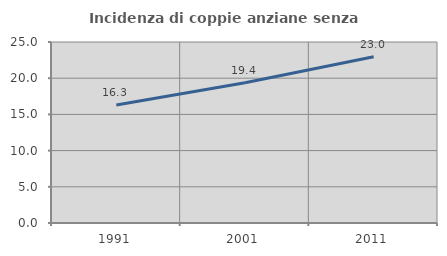
| Category | Incidenza di coppie anziane senza figli  |
|---|---|
| 1991.0 | 16.304 |
| 2001.0 | 19.375 |
| 2011.0 | 22.963 |